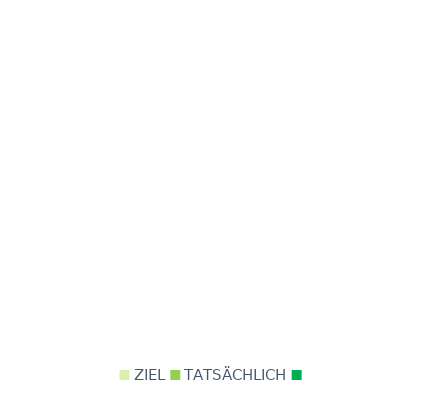
| Category | Series 0 |
|---|---|
| ZIEL | 0 |
| TATSÄCHLICH | 0 |